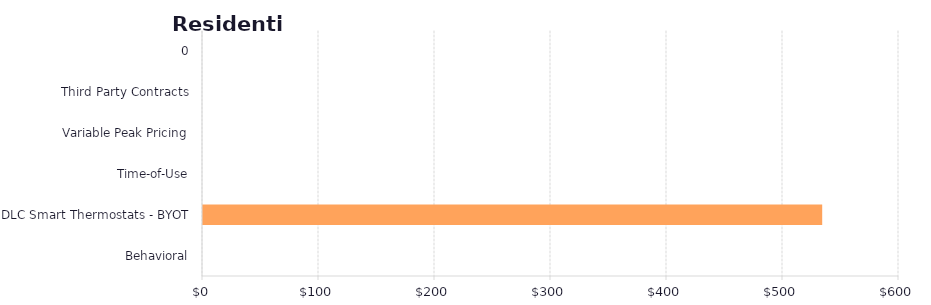
| Category | Series 1 |
|---|---|
| Behavioral | 0 |
| DLC Smart Thermostats - BYOT | 533.793 |
| Time-of-Use | 0 |
| Variable Peak Pricing | 0 |
| Third Party Contracts | 0 |
| 0 | 0 |